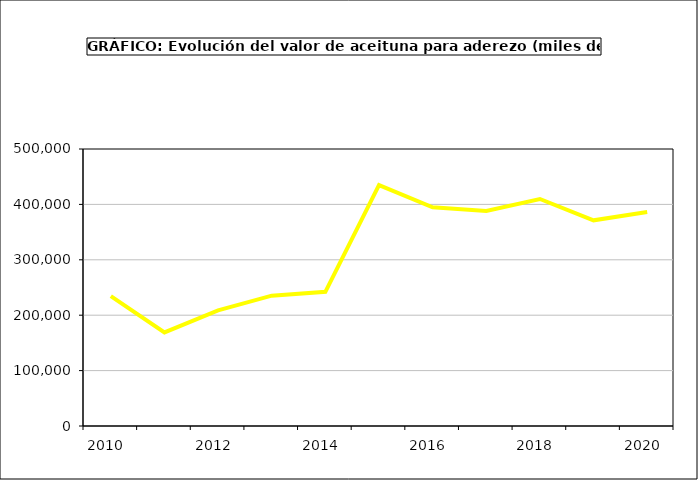
| Category | producción |
|---|---|
| 2010.0 | 234593.447 |
| 2011.0 | 168933.753 |
| 2012.0 | 208668.687 |
| 2013.0 | 235213.576 |
| 2014.0 | 242272.525 |
| 2015.0 | 434946 |
| 2016.0 | 394686 |
| 2017.0 | 388313.865 |
| 2018.0 | 409725.361 |
| 2019.0 | 371208.518 |
| 2020.0 | 386355.608 |